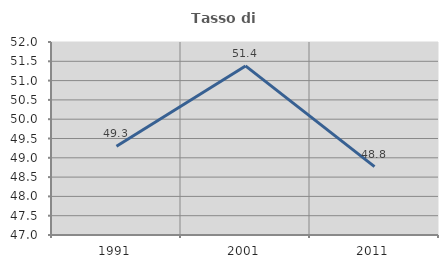
| Category | Tasso di occupazione   |
|---|---|
| 1991.0 | 49.299 |
| 2001.0 | 51.381 |
| 2011.0 | 48.771 |